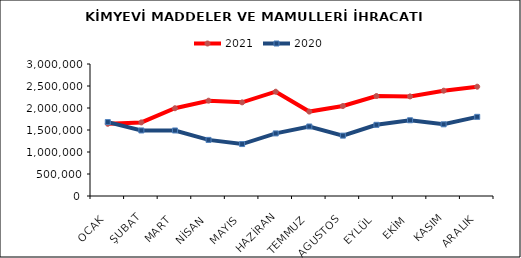
| Category | 2021 | 2020 |
|---|---|---|
| OCAK | 1641046.595 | 1680042.068 |
| ŞUBAT | 1672673.263 | 1489521.733 |
| MART | 1994357.655 | 1489041.585 |
| NİSAN | 2166171.828 | 1275068.464 |
| MAYIS | 2128373.635 | 1180635.496 |
| HAZİRAN | 2370181.101 | 1422568.889 |
| TEMMUZ | 1918277.29 | 1579568.797 |
| AGUSTOS | 2044519.652 | 1372148.351 |
| EYLÜL | 2272242.83 | 1617726.538 |
| EKİM | 2263373.245 | 1721117.503 |
| KASIM | 2393286.999 | 1629441.319 |
| ARALIK | 2484044.232 | 1799124.296 |